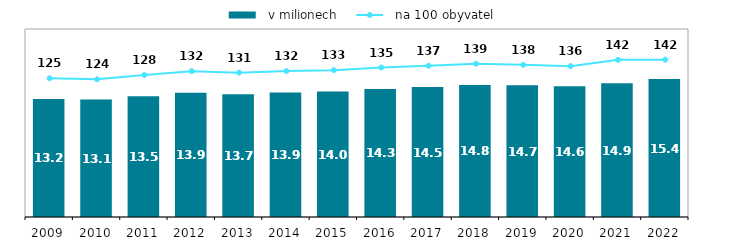
| Category |   v milionech |
|---|---|
| 2009.0 | 13.181 |
| 2010.0 | 13.113 |
| 2011.0 | 13.491 |
| 2012.0 | 13.87 |
| 2013.0 | 13.719 |
| 2014.0 | 13.914 |
| 2015.0 | 14.017 |
| 2016.0 | 14.299 |
| 2017.0 | 14.511 |
| 2018.0 | 14.756 |
| 2019.0 | 14.712 |
| 2020.0 | 14.6 |
| 2021.0 | 14.943 |
| 2022.0 | 15.408 |